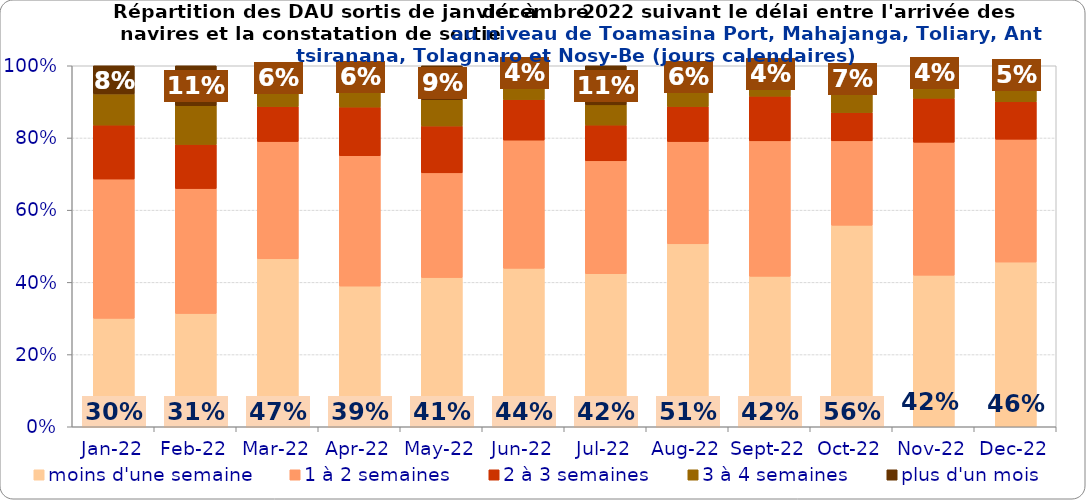
| Category | moins d'une semaine | 1 à 2 semaines | 2 à 3 semaines | 3 à 4 semaines | plus d'un mois |
|---|---|---|---|---|---|
| 2022-01-01 | 0.3 | 0.386 | 0.149 | 0.087 | 0.078 |
| 2022-02-01 | 0.314 | 0.346 | 0.122 | 0.107 | 0.111 |
| 2022-03-01 | 0.465 | 0.325 | 0.097 | 0.048 | 0.065 |
| 2022-04-01 | 0.39 | 0.361 | 0.135 | 0.054 | 0.061 |
| 2022-05-01 | 0.413 | 0.29 | 0.13 | 0.073 | 0.094 |
| 2022-06-01 | 0.439 | 0.355 | 0.112 | 0.053 | 0.041 |
| 2022-07-01 | 0.424 | 0.313 | 0.099 | 0.056 | 0.108 |
| 2022-08-01 | 0.507 | 0.283 | 0.097 | 0.051 | 0.062 |
| 2022-09-01 | 0.417 | 0.375 | 0.124 | 0.042 | 0.042 |
| 2022-10-01 | 0.558 | 0.234 | 0.078 | 0.06 | 0.07 |
| 2022-11-01 | 0.42 | 0.368 | 0.122 | 0.049 | 0.041 |
| 2022-12-01 | 0.456 | 0.34 | 0.104 | 0.051 | 0.049 |